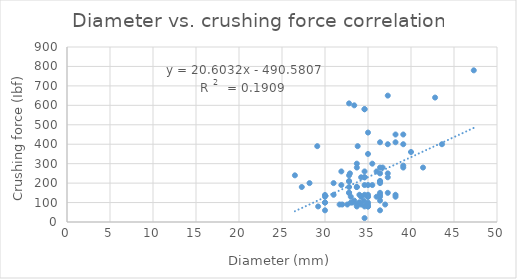
| Category | Series 0 |
|---|---|
| 41.4 | 280 |
| 36.7 | 280 |
| 32.8 | 240 |
| 43.6 | 400 |
| 47.3 | 780 |
| 40.0 | 360 |
| 35.0 | 190 |
| 30.0 | 130 |
| 37.3 | 650 |
| 34.5 | 110 |
| 39.1 | 400 |
| 36.4 | 110 |
| 34.6 | 230 |
| 33.8 | 390 |
| 34.6 | 580 |
| 30.0 | 100 |
| 37.3 | 400 |
| 33.0 | 130 |
| 38.2 | 450 |
| 37.3 | 150 |
| 39.1 | 290 |
| 39.1 | 280 |
| 36.4 | 250 |
| 34.6 | 580 |
| 32.8 | 180 |
| 33.7 | 280 |
| 34.0 | 140 |
| 42.8 | 640 |
| 38.2 | 130 |
| 33.7 | 300 |
| 35.0 | 350 |
| 39.1 | 450 |
| 36.0 | 260 |
| 38.2 | 140 |
| 36.0 | 130 |
| 28.2 | 200 |
| 32.8 | 150 |
| 32.8 | 610 |
| 33.0 | 100 |
| 29.1 | 390 |
| 35.0 | 130 |
| 35.0 | 460 |
| 29.2 | 80 |
| 36.4 | 410 |
| 34.0 | 100 |
| 35.5 | 300 |
| 31.0 | 140 |
| 38.2 | 410 |
| 32.8 | 150 |
| 36.4 | 280 |
| 31.9 | 190 |
| 32.0 | 90 |
| 36.4 | 130 |
| 37.0 | 90 |
| 35.0 | 100 |
| 33.7 | 80 |
| 34.2 | 230 |
| 36.4 | 140 |
| 36.4 | 60 |
| 34.0 | 100 |
| 36.4 | 200 |
| 30.0 | 60 |
| 34.6 | 190 |
| 34.2 | 90 |
| 35.5 | 190 |
| 26.5 | 240 |
| 32.8 | 210 |
| 35.0 | 90 |
| 34.6 | 140 |
| 33.4 | 600 |
| 36.4 | 150 |
| 30.0 | 100 |
| 31.0 | 200 |
| 36.4 | 210 |
| 33.2 | 100 |
| 32.8 | 210 |
| 32.6 | 90 |
| 33.7 | 180 |
| 32.9 | 250 |
| 27.3 | 180 |
| 33.4 | 110 |
| 35.0 | 140 |
| 34.2 | 130 |
| 36.4 | 210 |
| 34.6 | 80 |
| 37.3 | 250 |
| 31.7 | 90 |
| 33.7 | 180 |
| 30.0 | 139 |
| 34.6 | 260 |
| 35.0 | 80 |
| 34.6 | 230 |
| 33.7 | 90 |
| 36.4 | 210 |
| 34.8 | 90 |
| 31.9 | 260 |
| 35.0 | 80 |
| 34.6 | 20 |
| 35.0 | 130 |
| 37.3 | 230 |